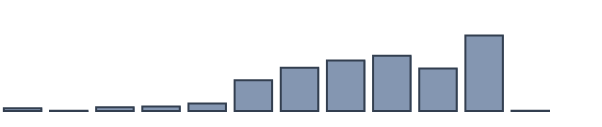
| Category | Series 0 |
|---|---|
| 0 | 0.9 |
| 1 | 0.1 |
| 2 | 1.2 |
| 3 | 1.4 |
| 4 | 2.4 |
| 5 | 9.7 |
| 6 | 13.6 |
| 7 | 15.9 |
| 8 | 17.4 |
| 9 | 13.4 |
| 10 | 23.8 |
| 11 | 0.1 |
| 12 | 0 |